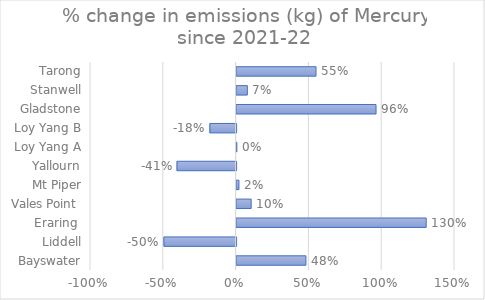
| Category | Mercury & compounds |
|---|---|
| Bayswater | 0.476 |
| Liddell | -0.496 |
|  Eraring  | 1.302 |
| Vales Point  | 0.1 |
| Mt Piper | 0.016 |
| Yallourn | -0.406 |
| Loy Yang A | 0.002 |
| Loy Yang B | -0.18 |
| Gladstone | 0.958 |
| Stanwell | 0.074 |
| Tarong | 0.545 |